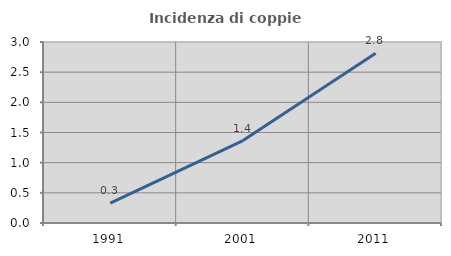
| Category | Incidenza di coppie miste |
|---|---|
| 1991.0 | 0.329 |
| 2001.0 | 1.366 |
| 2011.0 | 2.814 |